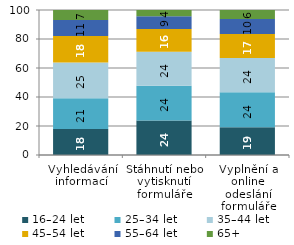
| Category | 16–24 let | 25–34 let | 35–44 let | 45–54 let | 55–64 let | 65+ |
|---|---|---|---|---|---|---|
| Vyhledávání informací | 17.854 | 21.22 | 24.71 | 18.23 | 11.054 | 6.931 |
| Stáhnutí nebo vytisknutí formuláře | 23.71 | 24.074 | 23.505 | 15.577 | 8.777 | 4.347 |
| Vyplnění a online odeslání formuláře | 19.075 | 24.158 | 23.643 | 16.634 | 10.356 | 6.134 |